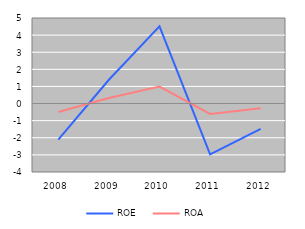
| Category | ROE | ROA |
|---|---|---|
| 2008 | -2.11 | -0.496 |
| 2009 | 1.39 | 0.32 |
| 2010 | 4.51 | 0.993 |
| 2011 | -2.97 | -0.606 |
| 2012 | -1.48 | -0.276 |